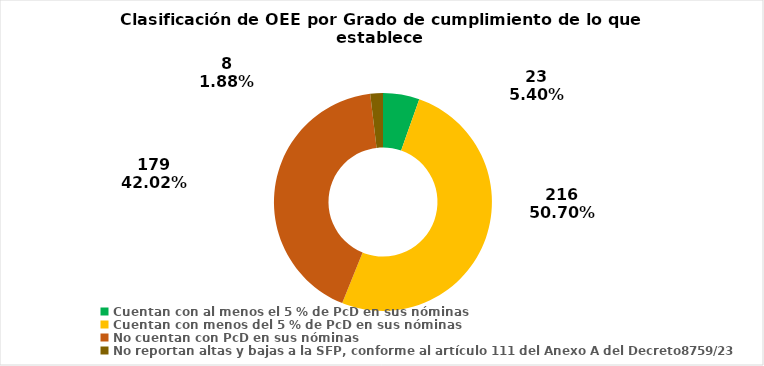
| Category | Series 0 |
|---|---|
| Cuentan con al menos el 5 % de PcD en sus nóminas | 23 |
| Cuentan con menos del 5 % de PcD en sus nóminas | 216 |
| No cuentan con PcD en sus nóminas | 179 |
| No reportan altas y bajas a la SFP, conforme al artículo 111 del Anexo A del Decreto8759/23 | 8 |